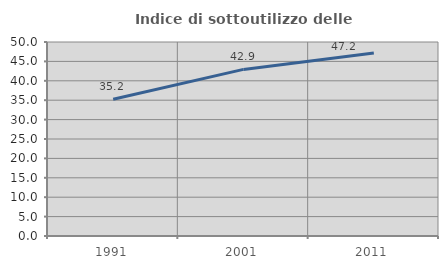
| Category | Indice di sottoutilizzo delle abitazioni  |
|---|---|
| 1991.0 | 35.224 |
| 2001.0 | 42.938 |
| 2011.0 | 47.154 |